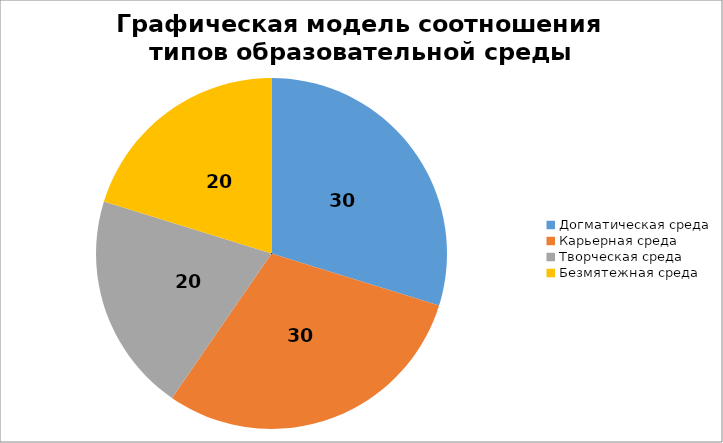
| Category | Графическая модель соотношения типов образовательной среды |
|---|---|
| Догматическая среда | 30.09 |
| Карьерная среда | 30.09 |
| Творческая среда | 20.4 |
| Безмятежная среда | 20.4 |